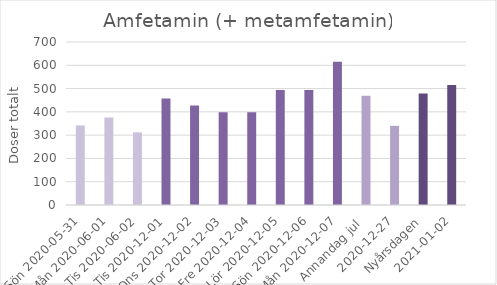
| Category | Amfetamin (+ metamfetamin) |
|---|---|
| Sön 2020-05-31 | 341.8 |
| Mån 2020-06-01 | 375.3 |
|  Tis 2020-06-02 | 311.8 |
| Tis 2020-12-01 | 456.9 |
| Ons 2020-12-02 | 427.1 |
| Tor 2020-12-03 | 398.8 |
| Fre 2020-12-04 | 398.7 |
| Lör 2020-12-05 | 493.5 |
| Sön 2020-12-06 | 493.6 |
| Mån 2020-12-07 | 615.4 |
| Annandag jul  | 469.1 |
| 2020-12-27 | 340 |
| Nyårsdagen | 478.3 |
| 2021-01-02 | 515.3 |